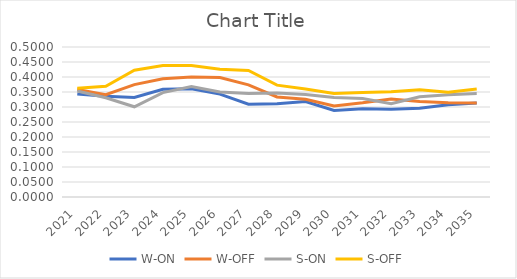
| Category | W-ON | W-OFF | S-ON | S-OFF |
|---|---|---|---|---|
| 2021.0 | 0.343 | 0.359 | 0.353 | 0.362 |
| 2022.0 | 0.336 | 0.341 | 0.331 | 0.369 |
| 2023.0 | 0.332 | 0.375 | 0.301 | 0.423 |
| 2024.0 | 0.359 | 0.394 | 0.348 | 0.439 |
| 2025.0 | 0.361 | 0.4 | 0.368 | 0.438 |
| 2026.0 | 0.343 | 0.398 | 0.35 | 0.426 |
| 2027.0 | 0.309 | 0.374 | 0.345 | 0.422 |
| 2028.0 | 0.311 | 0.333 | 0.347 | 0.373 |
| 2029.0 | 0.318 | 0.326 | 0.342 | 0.36 |
| 2030.0 | 0.288 | 0.303 | 0.332 | 0.345 |
| 2031.0 | 0.294 | 0.314 | 0.328 | 0.348 |
| 2032.0 | 0.292 | 0.327 | 0.311 | 0.351 |
| 2033.0 | 0.296 | 0.318 | 0.334 | 0.357 |
| 2034.0 | 0.308 | 0.314 | 0.341 | 0.349 |
| 2035.0 | 0.313 | 0.313 | 0.345 | 0.36 |